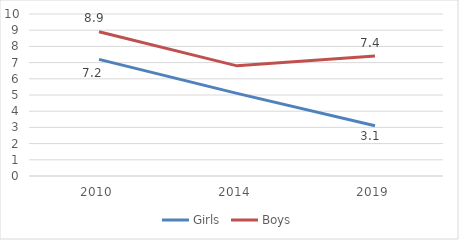
| Category | Girls | Boys |
|---|---|---|
| 2010.0 | 7.2 | 8.9 |
| 2014.0 | 5.1 | 6.8 |
| 2019.0 | 3.1 | 7.4 |